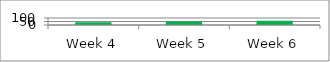
| Category | Series 0 |
|---|---|
| Week 4 | 40 |
| Week 5 | 50 |
| Week 6 | 60 |